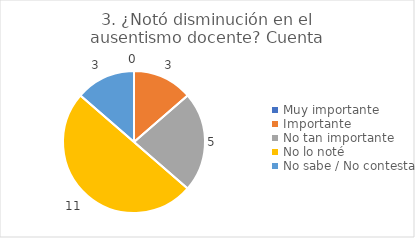
| Category | 3. ¿Notó disminución en el ausentismo docente? |
|---|---|
| Muy importante  | 0 |
| Importante  | 0.136 |
| No tan importante  | 0.227 |
| No lo noté  | 0.5 |
| No sabe / No contesta | 0.136 |